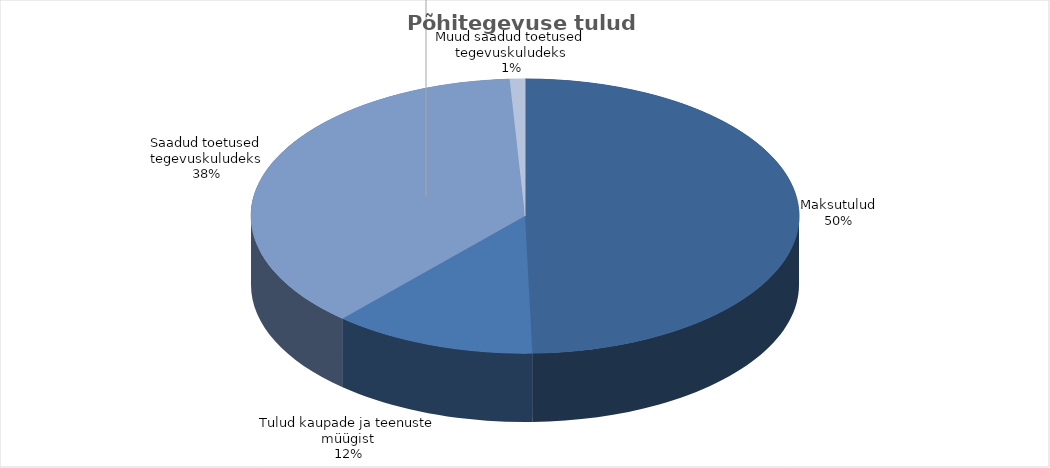
| Category | Series 0 |
|---|---|
| 0 | 6042984 |
| 1 | 1463927 |
| 2 | 4573566 |
| 3 | 109203 |